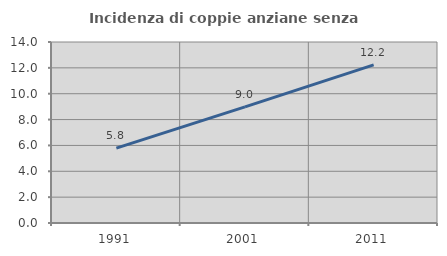
| Category | Incidenza di coppie anziane senza figli  |
|---|---|
| 1991.0 | 5.786 |
| 2001.0 | 8.98 |
| 2011.0 | 12.236 |